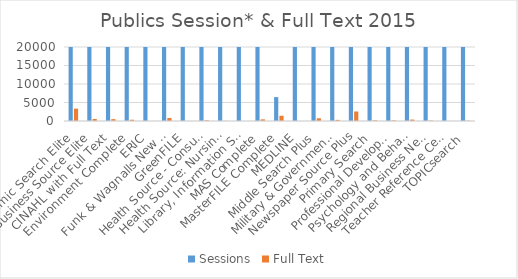
| Category | Sessions | Full Text |
|---|---|---|
| Academic Search Elite | 398077 | 3338 |
| Business Source Elite | 396824 | 548 |
| CINAHL with Full Text | 397006 | 503 |
| Environment Complete | 396746 | 340 |
| ERIC | 396936 | 0 |
| Funk & Wagnalls New World Encyclopedia | 358297 | 809 |
| GreenFILE | 396647 | 10 |
| Health Source - Consumer Edition | 397112 | 186 |
| Health Source: Nursing/Academic Edition | 396553 | 31 |
| Library, Information Science & Technology Abstracts | 396725 | 0 |
| MAS Complete | 120864 | 449 |
| MasterFILE Complete | 6460 | 1420 |
| MEDLINE | 396627 | 0 |
| Middle Search Plus | 358671 | 733 |
| Military & Government Collection | 396755 | 309 |
| Newspaper Source Plus | 397776 | 2570 |
| Primary Search | 358257 | 179 |
| Professional Development Collection | 396620 | 161 |
| Psychology and Behavioral Sciences Collection | 396602 | 384 |
| Regional Business News | 357626 | 116 |
| Teacher Reference Center | 396799 | 0 |
| TOPICsearch | 397287 | 81 |